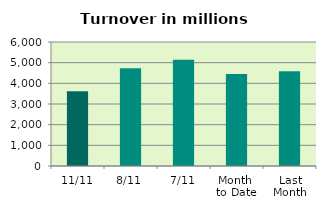
| Category | Series 0 |
|---|---|
| 11/11 | 3614.801 |
| 8/11 | 4730.736 |
| 7/11 | 5144.877 |
| Month 
to Date | 4451.29 |
| Last
Month | 4589.98 |